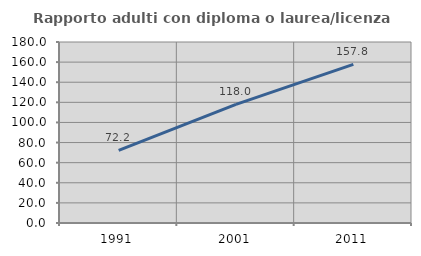
| Category | Rapporto adulti con diploma o laurea/licenza media  |
|---|---|
| 1991.0 | 72.222 |
| 2001.0 | 118.018 |
| 2011.0 | 157.812 |